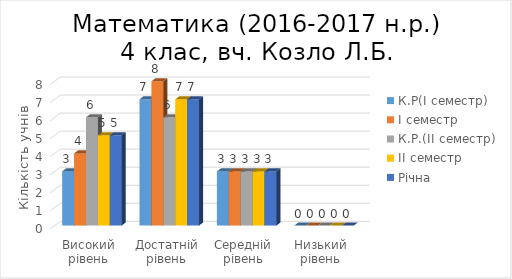
| Category | К.Р(І семестр) | І семестр | К.Р.(ІІ семестр) | ІІ семестр | Річна |
|---|---|---|---|---|---|
| Високий рівень | 3 | 4 | 6 | 5 | 5 |
| Достатній рівень | 7 | 8 | 6 | 7 | 7 |
| Середній рівень | 3 | 3 | 3 | 3 | 3 |
| Низький рівень | 0 | 0 | 0 | 0 | 0 |